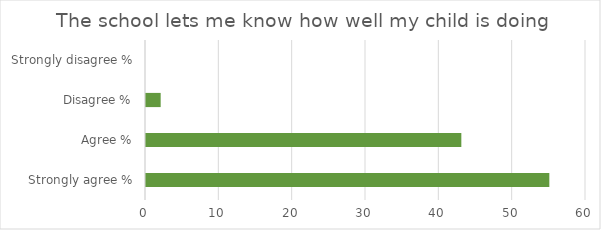
| Category | Series 1 |
|---|---|
| Strongly agree % | 55 |
| Agree % | 43 |
| Disagree % | 2 |
| Strongly disagree % | 0 |